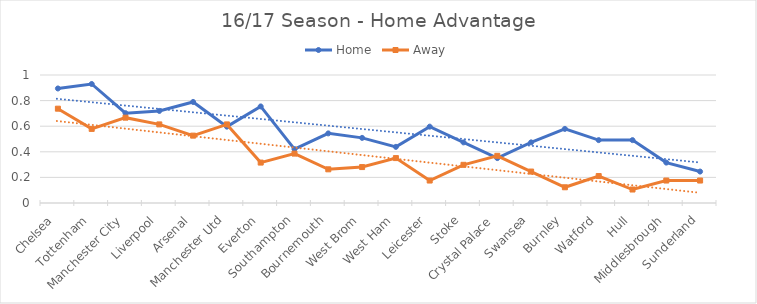
| Category | Home | Away |
|---|---|---|
| Chelsea | 0.895 | 0.737 |
| Tottenham | 0.93 | 0.579 |
| Manchester City | 0.702 | 0.667 |
| Liverpool | 0.719 | 0.614 |
| Arsenal | 0.789 | 0.526 |
| Manchester Utd | 0.596 | 0.614 |
| Everton | 0.754 | 0.316 |
| Southampton | 0.421 | 0.386 |
| Bournemouth | 0.544 | 0.263 |
| West Brom | 0.509 | 0.281 |
| West Ham | 0.439 | 0.351 |
| Leicester | 0.596 | 0.175 |
| Stoke | 0.474 | 0.298 |
| Crystal Palace | 0.351 | 0.368 |
| Swansea | 0.474 | 0.246 |
| Burnley | 0.579 | 0.123 |
| Watford | 0.491 | 0.211 |
| Hull | 0.491 | 0.105 |
| Middlesbrough | 0.316 | 0.175 |
| Sunderland | 0.246 | 0.175 |